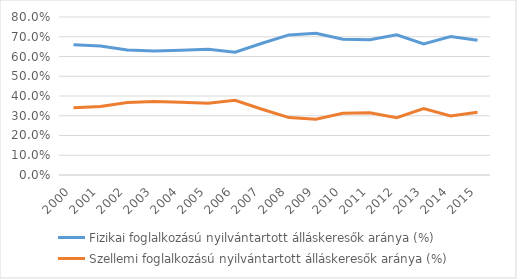
| Category | Fizikai foglalkozású nyilvántartott álláskeresők aránya (%) | Szellemi foglalkozású nyilvántartott álláskeresők aránya (%) |
|---|---|---|
| 2000.0 | 0.66 | 0.34 |
| 2001.0 | 0.654 | 0.346 |
| 2002.0 | 0.633 | 0.367 |
| 2003.0 | 0.628 | 0.372 |
| 2004.0 | 0.632 | 0.368 |
| 2005.0 | 0.637 | 0.363 |
| 2006.0 | 0.621 | 0.379 |
| 2007.0 | 0.667 | 0.333 |
| 2008.0 | 0.709 | 0.291 |
| 2009.0 | 0.718 | 0.282 |
| 2010.0 | 0.688 | 0.312 |
| 2011.0 | 0.685 | 0.315 |
| 2012.0 | 0.71 | 0.29 |
| 2013.0 | 0.664 | 0.336 |
| 2014.0 | 0.701 | 0.299 |
| 2015.0 | 0.682 | 0.318 |